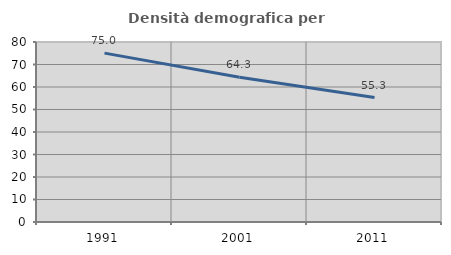
| Category | Densità demografica |
|---|---|
| 1991.0 | 75.047 |
| 2001.0 | 64.319 |
| 2011.0 | 55.301 |